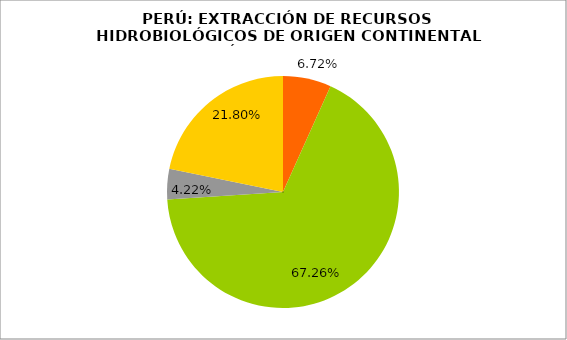
| Category | Series 0 |
|---|---|
| Boquichico | 0.067 |
| Trucha | 0.673 |
| Tilapia | 0.042 |
| Otros | 0.218 |